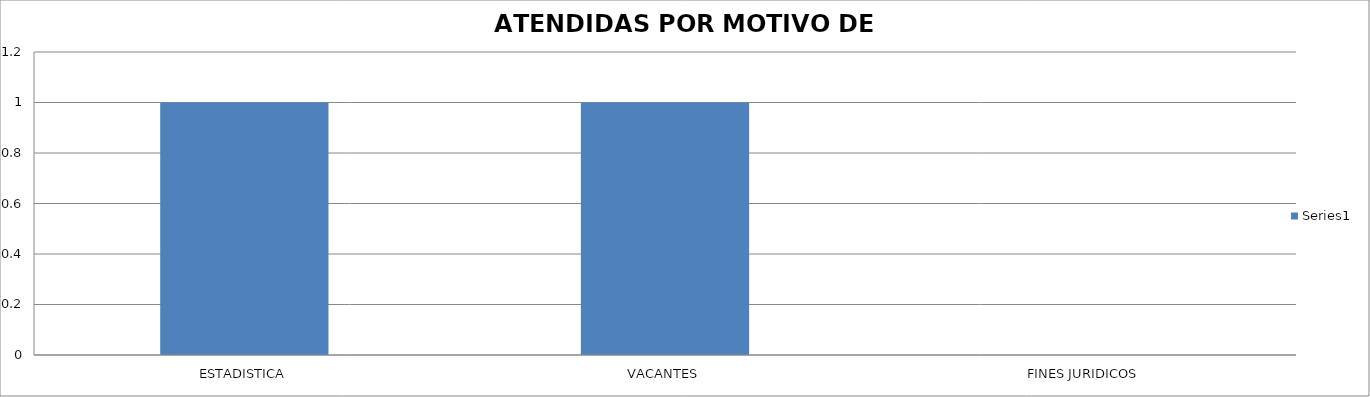
| Category | Series 0 |
|---|---|
| ESTADISTICA | 1 |
| VACANTES | 1 |
| FINES JURIDICOS | 0 |